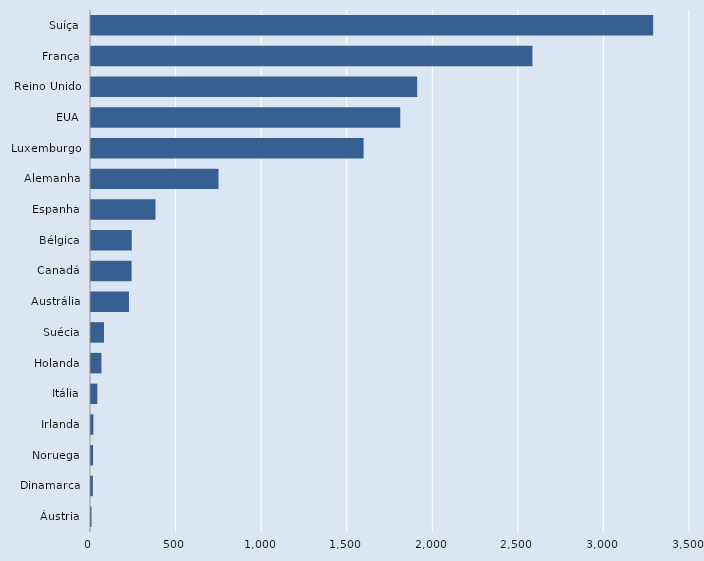
| Category | Series 0 |
|---|---|
| Áustria | 3 |
| Dinamarca | 11 |
| Noruega | 12 |
| Irlanda | 14 |
| Itália | 37 |
| Holanda | 61 |
| Suécia | 76 |
| Austrália | 222 |
| Canadá | 237 |
| Bélgica | 238 |
| Espanha | 377 |
| Alemanha | 745 |
| Luxemburgo | 1593 |
| EUA | 1807 |
| Reino Unido | 1906 |
| França | 2579 |
| Suíça | 3285 |